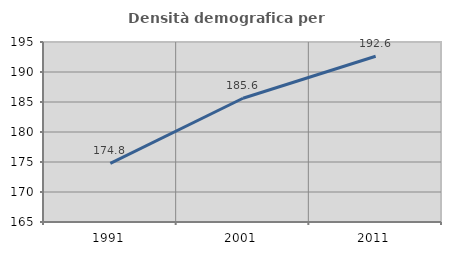
| Category | Densità demografica |
|---|---|
| 1991.0 | 174.775 |
| 2001.0 | 185.621 |
| 2011.0 | 192.617 |